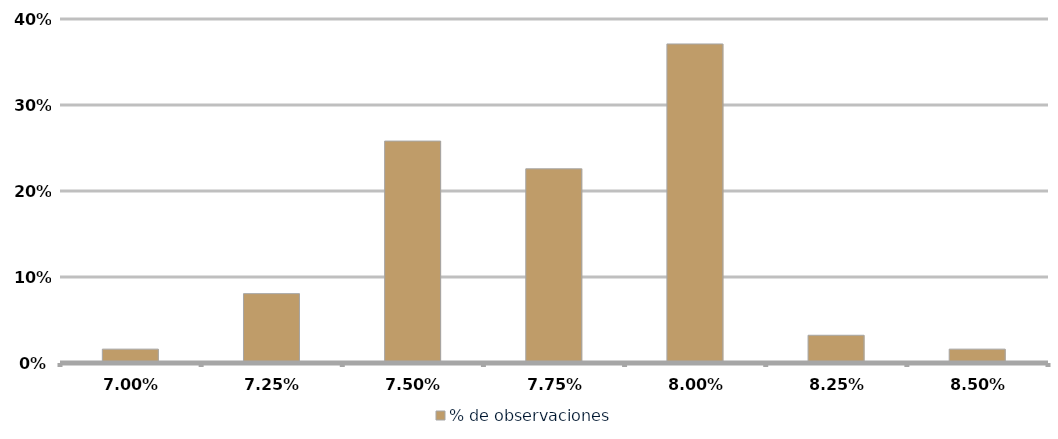
| Category | % de observaciones  |
|---|---|
| 0.06999999999999999 | 0.016 |
| 0.0725 | 0.081 |
| 0.075 | 0.258 |
| 0.0775 | 0.226 |
| 0.08 | 0.371 |
| 0.0825 | 0.032 |
| 0.085 | 0.016 |